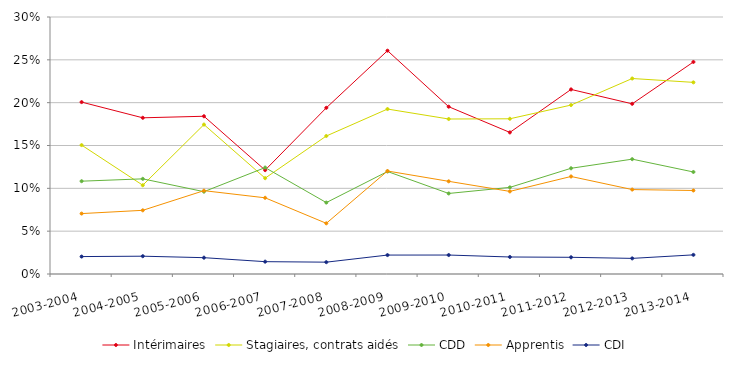
| Category | Intérimaires | Stagiaires, contrats aidés | CDD | Apprentis | CDI |
|---|---|---|---|---|---|
| 2003-2004 | 0.201 | 0.15 | 0.108 | 0.071 | 0.02 |
| 2004-2005 | 0.182 | 0.104 | 0.111 | 0.074 | 0.021 |
| 2005-2006 | 0.184 | 0.174 | 0.096 | 0.097 | 0.019 |
| 2006-2007 | 0.121 | 0.112 | 0.124 | 0.089 | 0.014 |
| 2007-2008 | 0.194 | 0.161 | 0.083 | 0.059 | 0.014 |
| 2008-2009 | 0.261 | 0.193 | 0.12 | 0.12 | 0.022 |
| 2009-2010 | 0.195 | 0.181 | 0.094 | 0.108 | 0.022 |
| 2010-2011 | 0.165 | 0.181 | 0.101 | 0.096 | 0.02 |
| 2011-2012 | 0.215 | 0.197 | 0.123 | 0.114 | 0.019 |
| 2012-2013 | 0.199 | 0.228 | 0.134 | 0.099 | 0.018 |
| 2013-2014 | 0.248 | 0.224 | 0.119 | 0.097 | 0.022 |